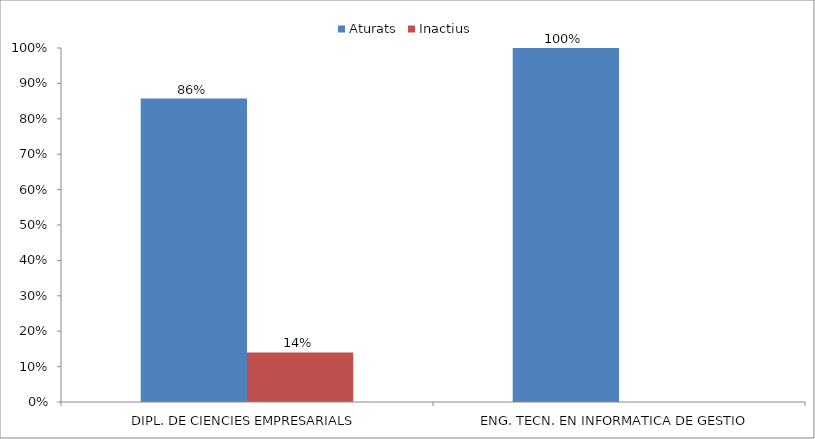
| Category | Aturats | Inactius |
|---|---|---|
| DIPL. DE CIENCIES EMPRESARIALS | 0.857 | 0.14 |
| ENG. TECN. EN INFORMATICA DE GESTIO | 1 | 0 |